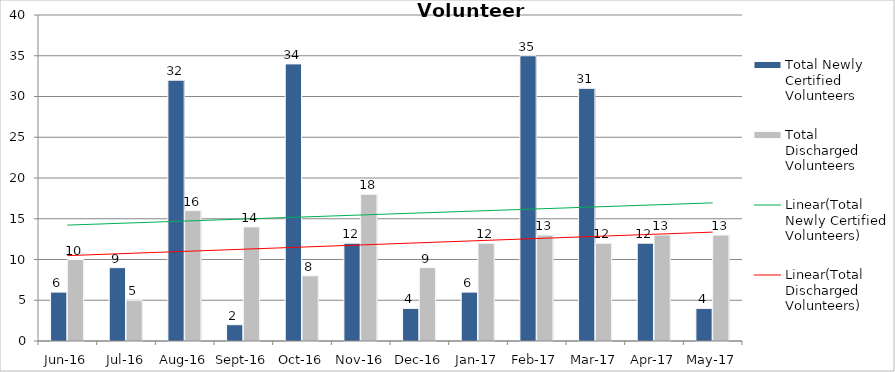
| Category | Total Newly Certified Volunteers | Total Discharged Volunteers |
|---|---|---|
| Jun-16 | 6 | 10 |
| Jul-16 | 9 | 5 |
| Aug-16 | 32 | 16 |
| Sep-16 | 2 | 14 |
| Oct-16 | 34 | 8 |
| Nov-16 | 12 | 18 |
| Dec-16 | 4 | 9 |
| Jan-17 | 6 | 12 |
| Feb-17 | 35 | 13 |
| Mar-17 | 31 | 12 |
| Apr-17 | 12 | 13 |
| May-17 | 4 | 13 |